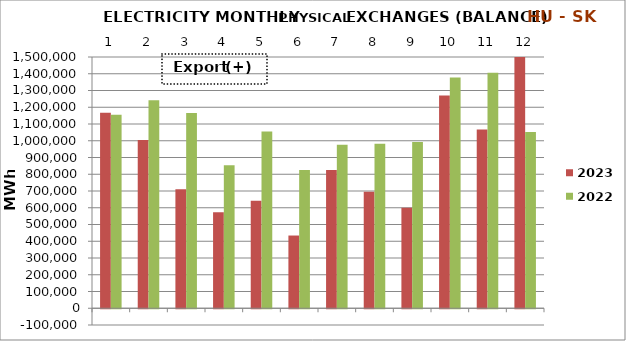
| Category | 2023 | 2022 |
|---|---|---|
| 0 | 1166585.06 | 1154593.08 |
| 1 | 1004039.276 | 1241919.946 |
| 2 | 710374.65 | 1165323.234 |
| 3 | 572949.227 | 854022.263 |
| 4 | 641721.635 | 1055166.712 |
| 5 | 434167.914 | 826082.203 |
| 6 | 825008.214 | 976087.861 |
| 7 | 695909.153 | 981687.692 |
| 8 | 600140.25 | 991996.086 |
| 9 | 1269476.064 | 1378302.754 |
| 10 | 1067741.083 | 1405605.898 |
| 11 | 1522866.782 | 1052537.086 |